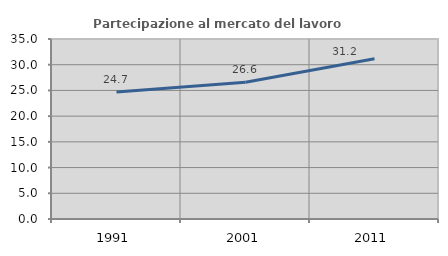
| Category | Partecipazione al mercato del lavoro  femminile |
|---|---|
| 1991.0 | 24.69 |
| 2001.0 | 26.586 |
| 2011.0 | 31.177 |